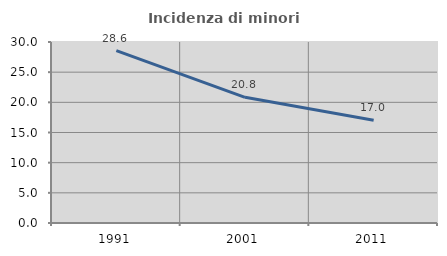
| Category | Incidenza di minori stranieri |
|---|---|
| 1991.0 | 28.571 |
| 2001.0 | 20.833 |
| 2011.0 | 17.045 |